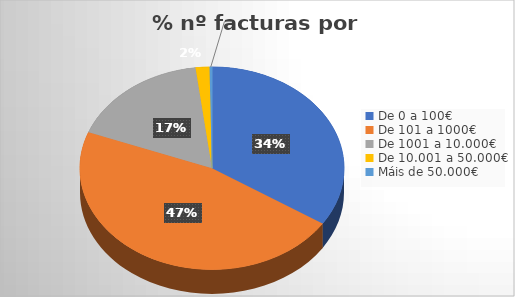
| Category | Series 0 | Rexional | Nacional | Estranxeiro | Total |
|---|---|---|---|---|---|
| De 0 a 100€ | 0.342 | 0.025 | 0.137 | 0.01 | 0.342 |
| De 101 a 1000€ | 0.466 | 0.046 | 0.134 | 0.026 | 0.466 |
| De 1001 a 10.000€ | 0.172 | 0.025 | 0.053 | 0.009 | 0.172 |
| De 10.001 a 50.000€ | 0.017 | 0.001 | 0.008 | 0.001 | 0.017 |
| Máis de 50.000€ | 0.003 | 0 | 0.002 | 0 | 0.003 |